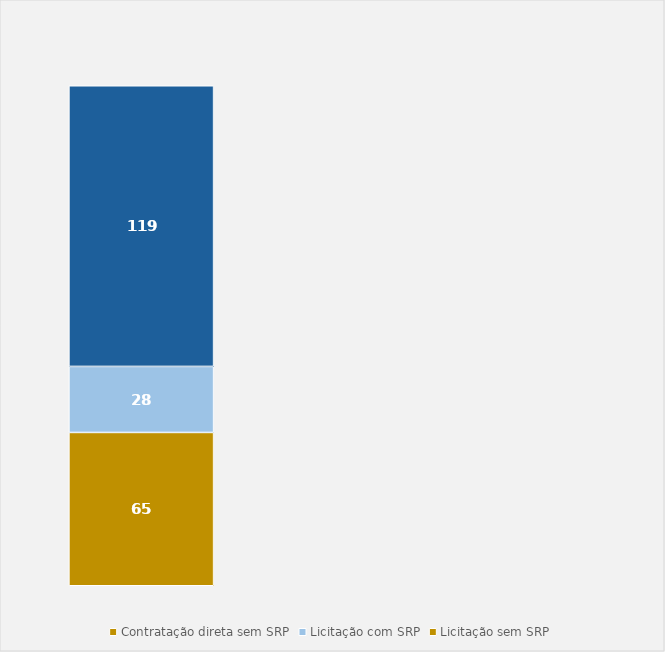
| Category | Contratação direta sem SRP | Licitação com SRP | Licitação sem SRP |
|---|---|---|---|
| Total | 65 | 28 | 119 |